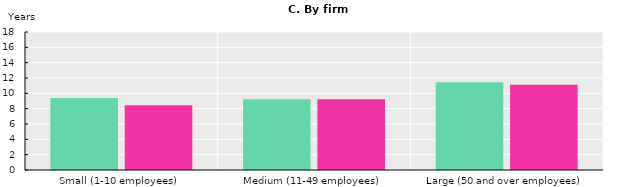
| Category | Men | Women |
|---|---|---|
| Small (1-10 employees) | 9.386 | 8.442 |
| Medium (11-49 employees) | 9.244 | 9.226 |
| Large (50 and over employees) | 11.439 | 11.107 |